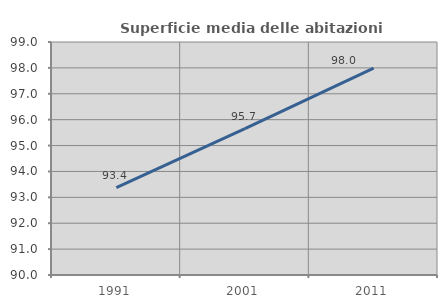
| Category | Superficie media delle abitazioni occupate |
|---|---|
| 1991.0 | 93.379 |
| 2001.0 | 95.65 |
| 2011.0 | 97.994 |